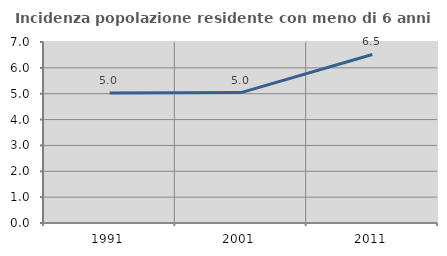
| Category | Incidenza popolazione residente con meno di 6 anni |
|---|---|
| 1991.0 | 5.032 |
| 2001.0 | 5.044 |
| 2011.0 | 6.518 |